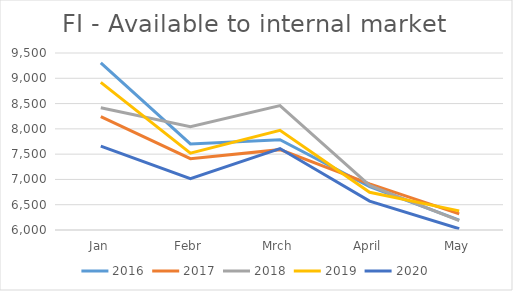
| Category | 2016 | 2017 | 2018 | 2019 | 2020 |
|---|---|---|---|---|---|
| Jan | 9303 | 8240 | 8417 | 8918 | 7657.304 |
| Febr | 7703 | 7411 | 8044 | 7520 | 7015.868 |
| Mrch | 7786 | 7589 | 8460 | 7972 | 7610.403 |
| April | 6860 | 6912 | 6881 | 6745 | 6570.248 |
| May | 6195 | 6319 | 6187 | 6378 | 6025.095 |